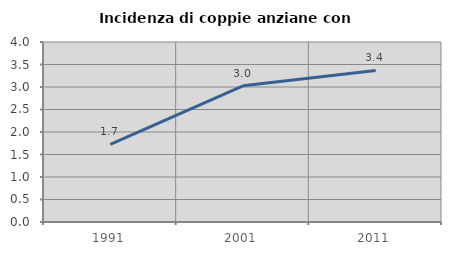
| Category | Incidenza di coppie anziane con figli |
|---|---|
| 1991.0 | 1.726 |
| 2001.0 | 3.026 |
| 2011.0 | 3.367 |